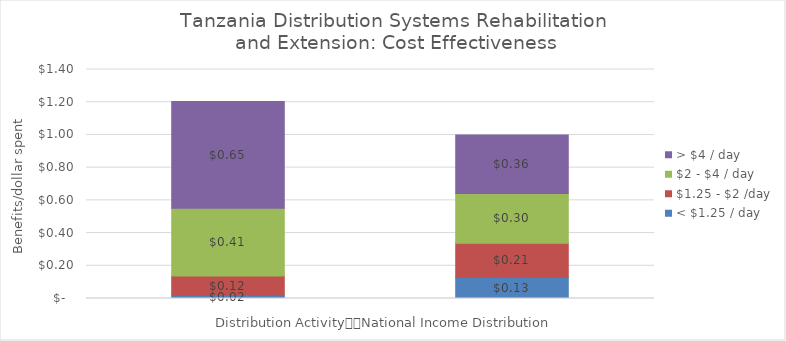
| Category | < $1.25 / day | $1.25 - $2 /day | $2 - $4 / day | > $4 / day |
|---|---|---|---|---|
|  | 0.019 | 0.118 | 0.414 | 0.653 |
|  | 0.13 | 0.208 | 0.304 | 0.358 |